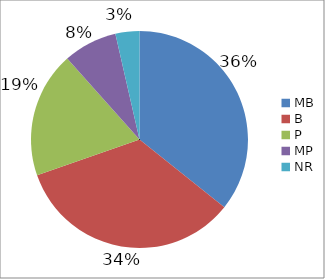
| Category | Series 0 |
|---|---|
| MB | 0.357 |
| B | 0.339 |
| P | 0.188 |
| MP | 0.08 |
| NR | 0.036 |